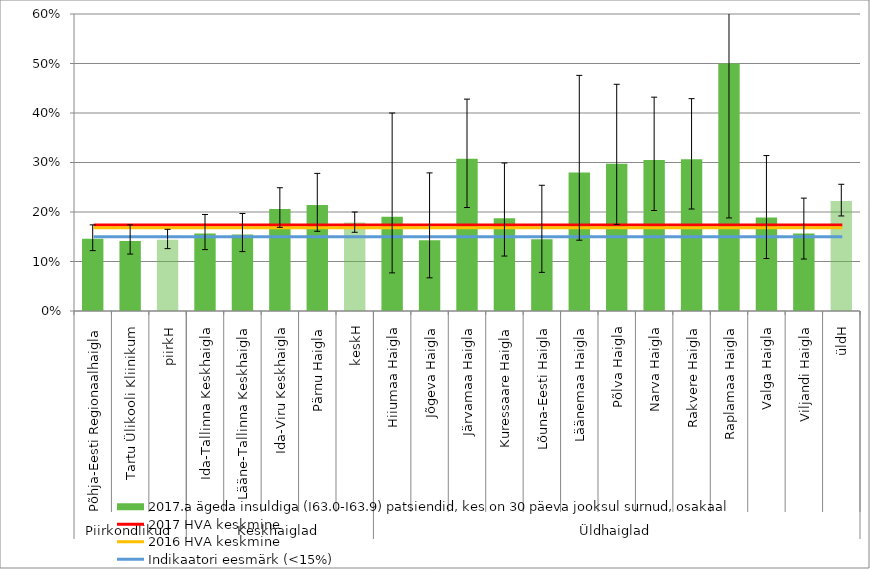
| Category | 2017.a ägeda insuldiga (I63.0-I63.9) patsiendid, kes on 30 päeva jooksul surnud, osakaal |
|---|---|
| 0 | 0.146 |
| 1 | 0.142 |
| 2 | 0.144 |
| 3 | 0.156 |
| 4 | 0.155 |
| 5 | 0.206 |
| 6 | 0.214 |
| 7 | 0.179 |
| 8 | 0.19 |
| 9 | 0.143 |
| 10 | 0.308 |
| 11 | 0.188 |
| 12 | 0.145 |
| 13 | 0.28 |
| 14 | 0.297 |
| 15 | 0.305 |
| 16 | 0.306 |
| 17 | 0.5 |
| 18 | 0.189 |
| 19 | 0.157 |
| 20 | 0.222 |